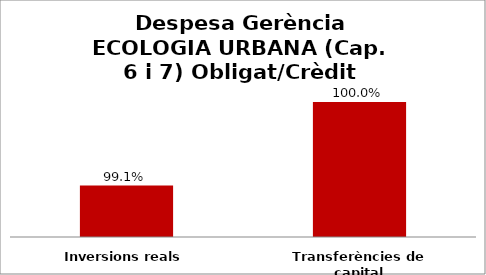
| Category | Series 0 |
|---|---|
| Inversions reals | 0.991 |
| Transferències de capital | 1 |